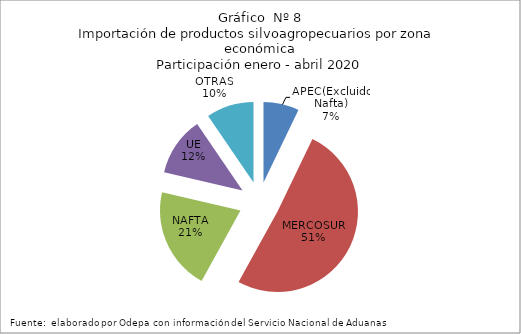
| Category | Series 0 |
|---|---|
| APEC(Excluido Nafta) | 148874.224 |
| MERCOSUR | 1060793.07 |
| NAFTA | 429502.878 |
| UE | 246813.012 |
| OTRAS | 198587.816 |